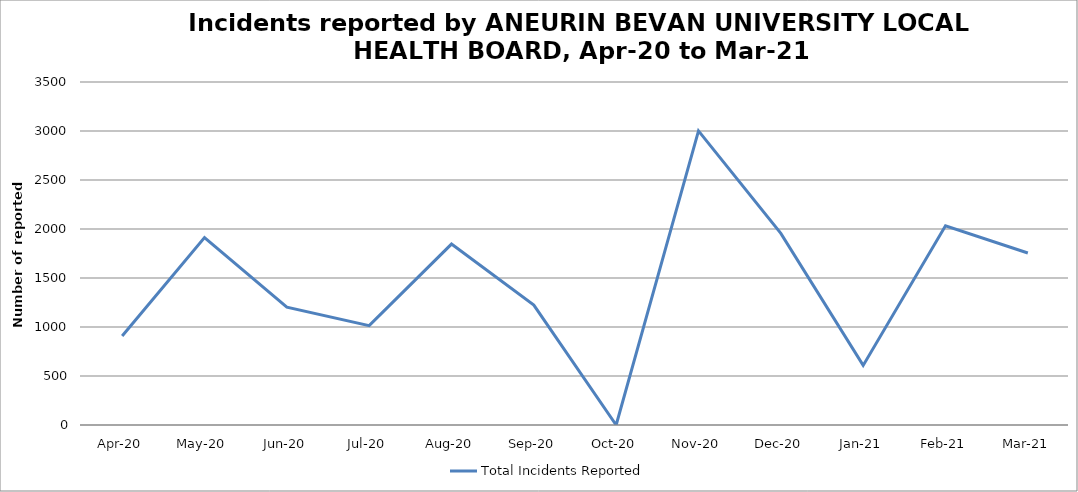
| Category | Total Incidents Reported |
|---|---|
| Apr-20 | 908 |
| May-20 | 1913 |
| Jun-20 | 1202 |
| Jul-20 | 1014 |
| Aug-20 | 1846 |
| Sep-20 | 1224 |
| Oct-20 | 0 |
| Nov-20 | 3001 |
| Dec-20 | 1955 |
| Jan-21 | 608 |
| Feb-21 | 2033 |
| Mar-21 | 1755 |